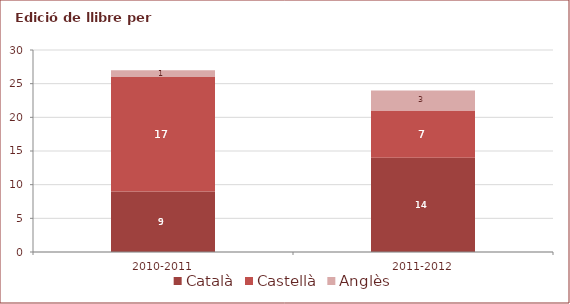
| Category | Català | Castellà | Anglès |
|---|---|---|---|
| 2010-2011 | 9 | 17 | 1 |
| 2011-2012 | 14 | 7 | 3 |